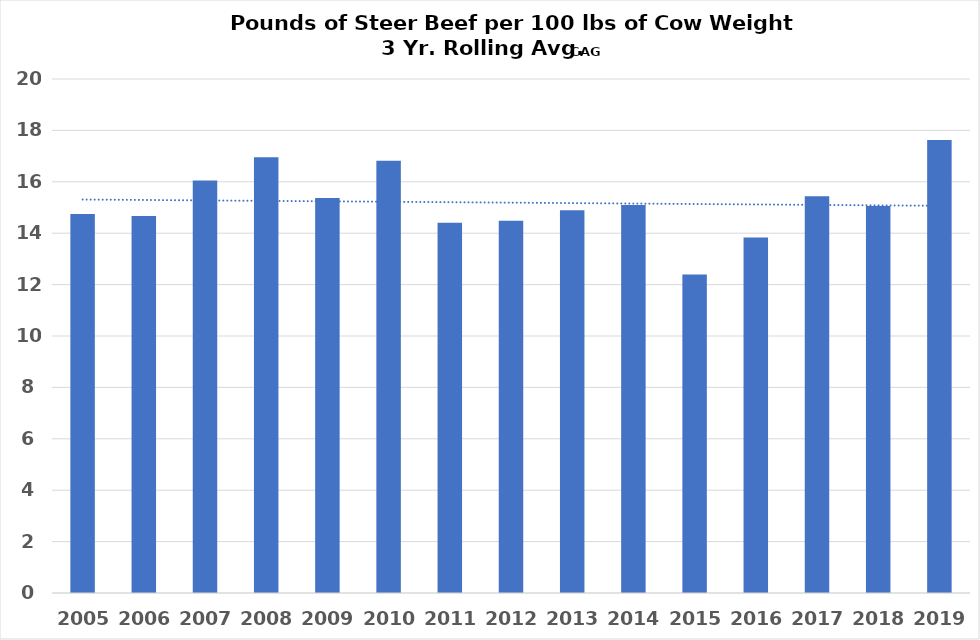
| Category | Steer Beef pounds/ Cwt Cow Weight |
|---|---|
| 2005.0 | 14.743 |
| 2006.0 | 14.67 |
| 2007.0 | 16.047 |
| 2008.0 | 16.952 |
| 2009.0 | 15.369 |
| 2010.0 | 16.818 |
| 2011.0 | 14.403 |
| 2012.0 | 14.485 |
| 2013.0 | 14.896 |
| 2014.0 | 15.095 |
| 2015.0 | 12.389 |
| 2016.0 | 13.831 |
| 2017.0 | 15.442 |
| 2018.0 | 15.061 |
| 2019.0 | 17.626 |